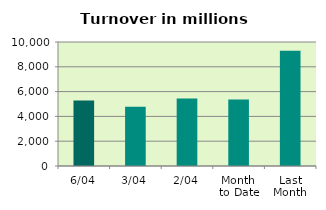
| Category | Series 0 |
|---|---|
| 6/04 | 5289.129 |
| 3/04 | 4781.348 |
| 2/04 | 5452.424 |
| Month 
to Date | 5359.476 |
| Last
Month | 9287.764 |